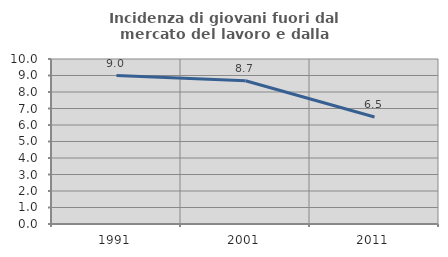
| Category | Incidenza di giovani fuori dal mercato del lavoro e dalla formazione  |
|---|---|
| 1991.0 | 8.996 |
| 2001.0 | 8.679 |
| 2011.0 | 6.486 |